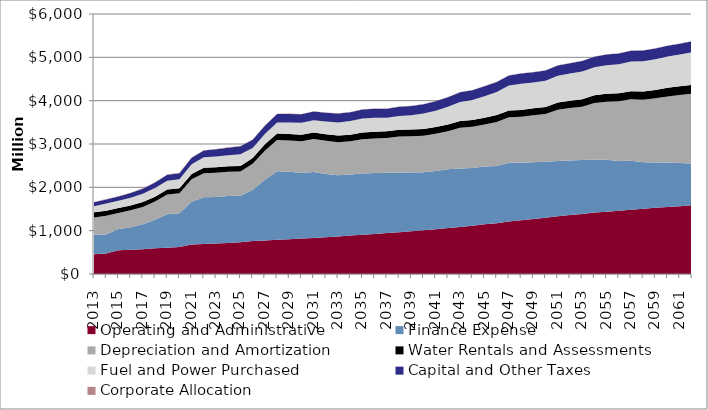
| Category | Operating and Administrative | Finance Expense | Depreciation and Amortization | Water Rentals and Assessments | Fuel and Power Purchased | Capital and Other Taxes | Corporate Allocation |
|---|---|---|---|---|---|---|---|
| 2013.0 | 455 | 452 | 399 | 117 | 143 | 87 | 9 |
| 2014.0 | 471 | 442 | 430 | 116 | 166 | 95 | 9 |
| 2015.0 | 546 | 491 | 372 | 112 | 167 | 101 | 8 |
| 2016.0 | 559 | 519 | 391 | 112 | 178 | 109 | 8 |
| 2017.0 | 570 | 577 | 400 | 112 | 191 | 119 | 8 |
| 2018.0 | 593 | 658 | 422 | 112 | 200 | 127 | 8 |
| 2019.0 | 605 | 774 | 458 | 112 | 205 | 134 | 8 |
| 2020.0 | 621 | 783 | 461 | 114 | 207 | 141 | 8 |
| 2021.0 | 678 | 989 | 518 | 124 | 222 | 149 | 8 |
| 2022.0 | 690 | 1083 | 553 | 127 | 239 | 158 | 8 |
| 2023.0 | 703 | 1075 | 559 | 128 | 247 | 166 | 8 |
| 2024.0 | 716 | 1083 | 558 | 128 | 256 | 174 | 8 |
| 2025.0 | 730 | 1077 | 561 | 127 | 270 | 181 | 8 |
| 2026.0 | 760 | 1182 | 600 | 135 | 233 | 187 | 8 |
| 2027.0 | 773 | 1403 | 668 | 148 | 238 | 190 | 8 |
| 2028.0 | 788 | 1584 | 721 | 150 | 256 | 192 | 8 |
| 2029.0 | 804 | 1553 | 724 | 151 | 266 | 195 | 8 |
| 2030.0 | 817 | 1515 | 732 | 151 | 275 | 197 | 8 |
| 2031.0 | 832 | 1523 | 758 | 152 | 282 | 201 | 7 |
| 2032.0 | 849 | 1459 | 766 | 153 | 292 | 202 | 7 |
| 2033.0 | 866 | 1413 | 764 | 153 | 302 | 203 | 7 |
| 2034.0 | 887 | 1407 | 768 | 154 | 312 | 204 | 7 |
| 2035.0 | 906 | 1412 | 792 | 154 | 324 | 206 | 7 |
| 2036.0 | 924 | 1408 | 796 | 154 | 325 | 207 | 7 |
| 2037.0 | 945 | 1394 | 802 | 154 | 309 | 208 | 7 |
| 2038.0 | 966 | 1375 | 834 | 155 | 317 | 210 | 7 |
| 2039.0 | 987 | 1355 | 838 | 155 | 330 | 212 | 7 |
| 2040.0 | 1010 | 1339 | 844 | 155 | 355 | 214 | 7 |
| 2041.0 | 1032 | 1347 | 857 | 156 | 376 | 218 | 7 |
| 2042.0 | 1062 | 1355 | 875 | 156 | 412 | 220 | 7 |
| 2043.0 | 1087 | 1347 | 943 | 156 | 436 | 223 | 7 |
| 2044.0 | 1113 | 1333 | 952 | 156 | 462 | 226 | 7 |
| 2045.0 | 1146 | 1333 | 971 | 157 | 496 | 228 | 6 |
| 2046.0 | 1174 | 1321 | 1015 | 157 | 533 | 232 | 6 |
| 2047.0 | 1210 | 1360 | 1045 | 157 | 577 | 234 | 6 |
| 2048.0 | 1240 | 1326 | 1061 | 157 | 609 | 236 | 6 |
| 2049.0 | 1269 | 1311 | 1084 | 163 | 593 | 237 | 6 |
| 2050.0 | 1300 | 1291 | 1099 | 166 | 604 | 237 | 6 |
| 2051.0 | 1331 | 1274 | 1184 | 169 | 615 | 239 | 6 |
| 2052.0 | 1364 | 1254 | 1210 | 172 | 626 | 240 | 6 |
| 2053.0 | 1385 | 1246 | 1228 | 175 | 637 | 242 | 6 |
| 2054.0 | 1418 | 1222 | 1305 | 178 | 649 | 244 | 6 |
| 2055.0 | 1439 | 1195 | 1343 | 181 | 661 | 244 | 6 |
| 2056.0 | 1460 | 1148 | 1377 | 184 | 673 | 246 | 6 |
| 2057.0 | 1482 | 1129 | 1420 | 188 | 685 | 246 | 6 |
| 2058.0 | 1504 | 1077 | 1441 | 191 | 697 | 247 | 6 |
| 2059.0 | 1526 | 1049 | 1479 | 194 | 710 | 248 | 6 |
| 2060.0 | 1549 | 1025 | 1525 | 198 | 722 | 249 | 6 |
| 2061.0 | 1564 | 995 | 1569 | 202 | 735 | 250 | 6 |
| 2062.0 | 1588 | 963 | 1611 | 205 | 749 | 251 | 6 |